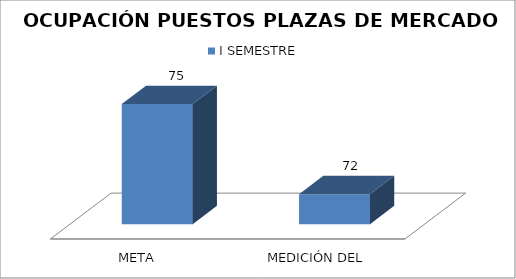
| Category | I SEMESTRE  |
|---|---|
| META | 75 |
| MEDICIÓN DEL INDICADOR | 72 |